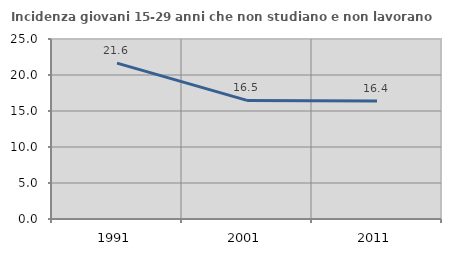
| Category | Incidenza giovani 15-29 anni che non studiano e non lavorano  |
|---|---|
| 1991.0 | 21.643 |
| 2001.0 | 16.474 |
| 2011.0 | 16.396 |